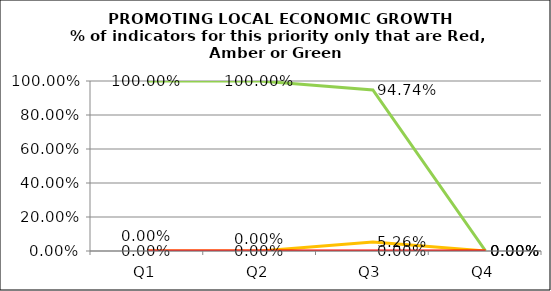
| Category | Green | Amber | Red |
|---|---|---|---|
| Q1 | 1 | 0 | 0 |
| Q2 | 1 | 0 | 0 |
| Q3 | 0.947 | 0.053 | 0 |
| Q4 | 0 | 0 | 0 |